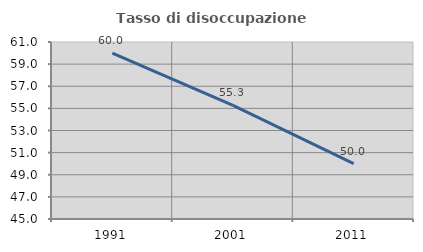
| Category | Tasso di disoccupazione giovanile  |
|---|---|
| 1991.0 | 60 |
| 2001.0 | 55.263 |
| 2011.0 | 50 |